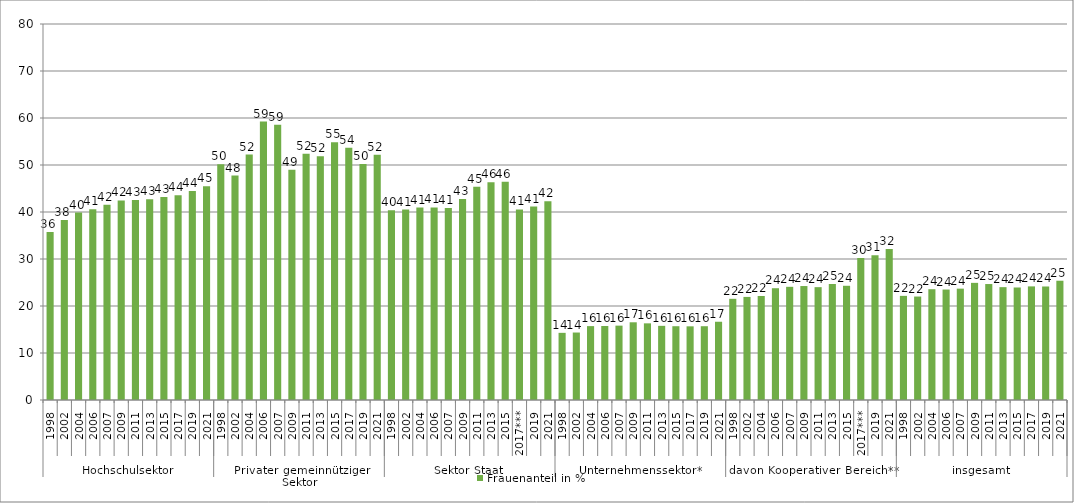
| Category | Frauenanteil in % |
|---|---|
| 0 | 35.757 |
| 1 | 38.276 |
| 2 | 39.874 |
| 3 | 40.608 |
| 4 | 41.525 |
| 5 | 42.452 |
| 6 | 42.537 |
| 7 | 42.687 |
| 8 | 43.196 |
| 9 | 43.545 |
| 10 | 44.489 |
| 11 | 45.485 |
| 12 | 50.135 |
| 13 | 47.755 |
| 14 | 52.217 |
| 15 | 59.252 |
| 16 | 58.559 |
| 17 | 48.979 |
| 18 | 52.393 |
| 19 | 51.867 |
| 20 | 54.816 |
| 21 | 53.665 |
| 22 | 50.2 |
| 23 | 52.177 |
| 24 | 40.349 |
| 25 | 40.523 |
| 26 | 40.939 |
| 27 | 40.964 |
| 28 | 40.871 |
| 29 | 42.763 |
| 30 | 45.38 |
| 31 | 46.327 |
| 32 | 46.456 |
| 33 | 40.541 |
| 34 | 41.148 |
| 35 | 42.289 |
| 36 | 14.289 |
| 37 | 14.356 |
| 38 | 15.721 |
| 39 | 15.748 |
| 40 | 15.822 |
| 41 | 16.535 |
| 42 | 16.31 |
| 43 | 15.777 |
| 44 | 15.699 |
| 45 | 15.675 |
| 46 | 15.7 |
| 47 | 16.65 |
| 48 | 21.527 |
| 49 | 21.931 |
| 50 | 22.128 |
| 51 | 23.783 |
| 52 | 24.081 |
| 53 | 24.248 |
| 54 | 24.01 |
| 55 | 24.686 |
| 56 | 24.301 |
| 57 | 30.229 |
| 58 | 30.779 |
| 59 | 32.127 |
| 60 | 22.155 |
| 61 | 22.012 |
| 62 | 23.575 |
| 63 | 23.505 |
| 64 | 23.694 |
| 65 | 24.923 |
| 66 | 24.673 |
| 67 | 24.011 |
| 68 | 23.938 |
| 69 | 24.173 |
| 70 | 24.151 |
| 71 | 25.377 |